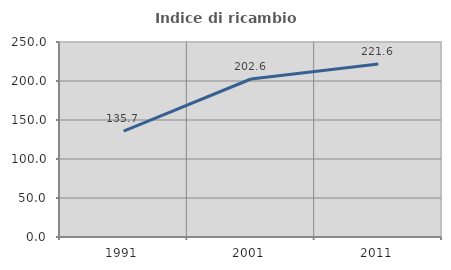
| Category | Indice di ricambio occupazionale  |
|---|---|
| 1991.0 | 135.714 |
| 2001.0 | 202.564 |
| 2011.0 | 221.649 |